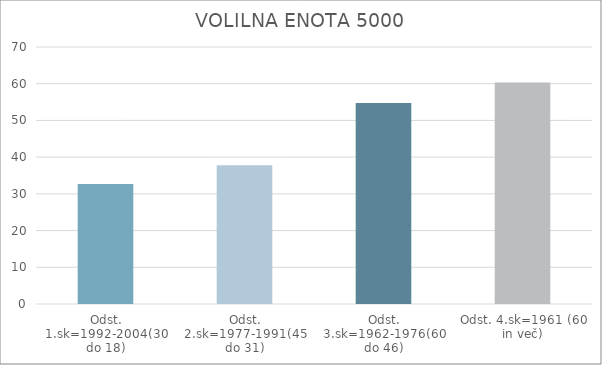
| Category | Series 0 |
|---|---|
| Odst. 1.sk=1992-2004(30 do 18) | 32.71 |
| Odst. 2.sk=1977-1991(45 do 31) | 37.79 |
| Odst. 3.sk=1962-1976(60 do 46) | 54.77 |
| Odst. 4.sk=1961 (60 in več) | 60.31 |